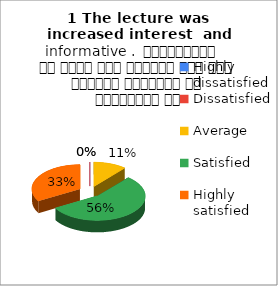
| Category | 1 The lecture was  increased interest  and informative .  व्याख्यान से रुचि में वृद्धि हुई एवं शिक्षण जानकारी से परिपूर्ण था |
|---|---|
| Highly dissatisfied | 0 |
| Dissatisfied | 0 |
| Average | 1 |
| Satisfied | 5 |
| Highly satisfied | 3 |